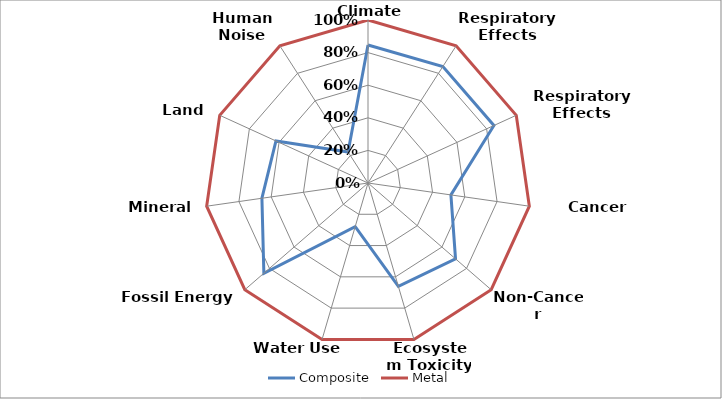
| Category | Composite | Metal |
|---|---|---|
| Climate Change | 0.846 | 1 |
| Respiratory Effects (Inorganic) | 0.85 | 1 |
| Respiratory Effects (Organic) | 0.849 | 1 |
| Cancer (External) | 0.514 | 1 |
| Non-Cancer (External) | 0.71 | 1 |
| Ecosystem Toxicity | 0.661 | 1 |
| Water Use Impact | 0.278 | 1 |
| Fossil Energy Use | 0.845 | 1 |
| Mineral Use | 0.657 | 1 |
| Land Use | 0.621 | 1 |
| Human Noise Exposure | 0.226 | 1 |